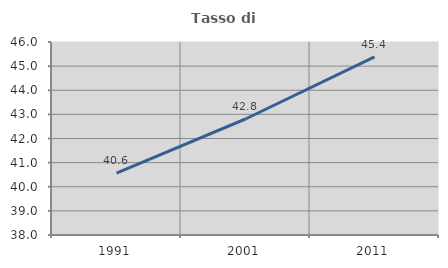
| Category | Tasso di occupazione   |
|---|---|
| 1991.0 | 40.566 |
| 2001.0 | 42.808 |
| 2011.0 | 45.382 |